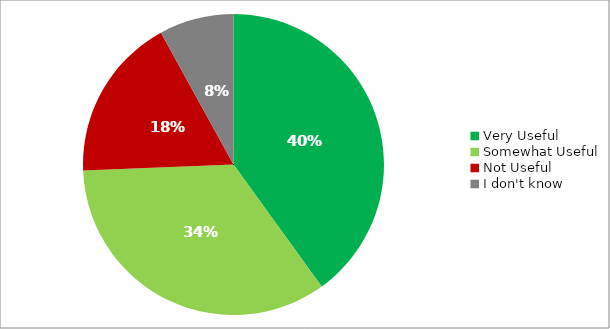
| Category | Responses |
|---|---|
| Very Useful | 0.4 |
| Somewhat Useful | 0.343 |
| Not Useful | 0.176 |
| I don't know | 0.08 |